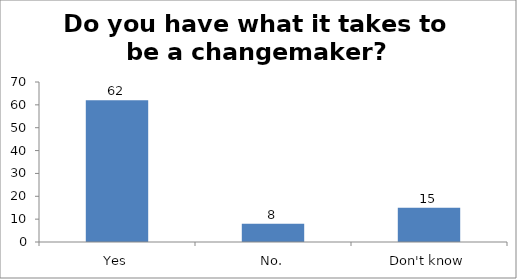
| Category | Do you have what it takes to be a changemaker? |
|---|---|
| Yes | 62 |
| No. | 8 |
| Don't know | 15 |